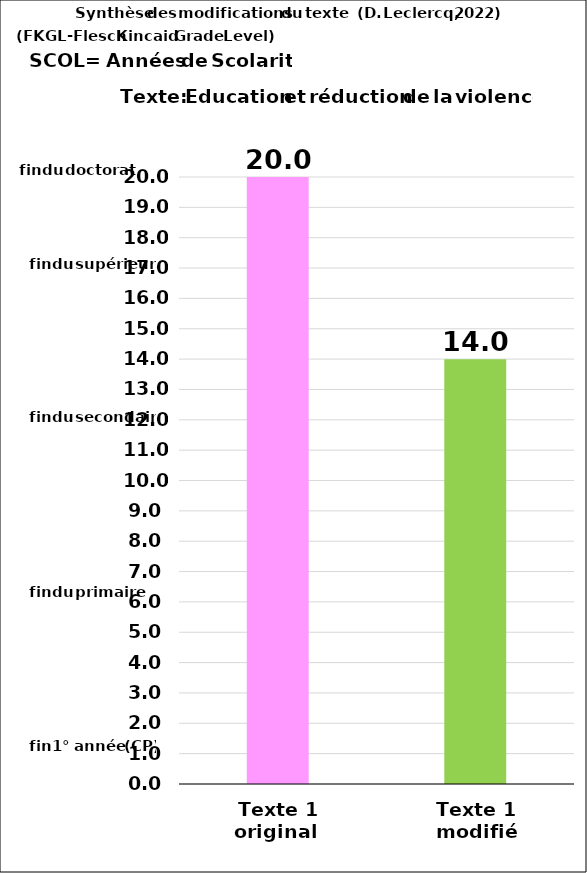
| Category | SCOL |
|---|---|
| Texte 1 original  | 20 |
| Texte 1 modifié | 13.994 |